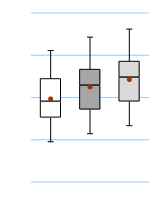
| Category | 25th | 50th | 75th |
|---|---|---|---|
| UK | 38.095 | 9.524 | 13.492 |
| Top 50% | 42.857 | 14.286 | 9.524 |
| Top 10% | 47.619 | 14.286 | 9.524 |